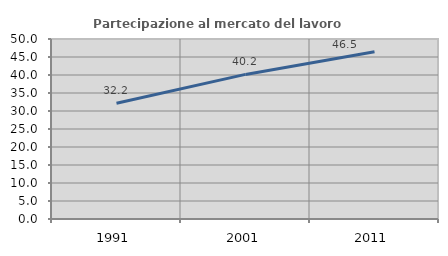
| Category | Partecipazione al mercato del lavoro  femminile |
|---|---|
| 1991.0 | 32.155 |
| 2001.0 | 40.165 |
| 2011.0 | 46.453 |